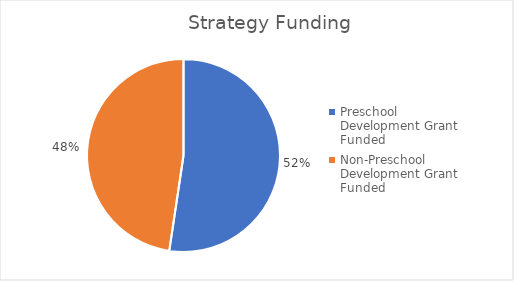
| Category | Count of activities |
|---|---|
| Preschool Development Grant Funded | 211 |
| Non-Preschool Development Grant Funded | 192 |